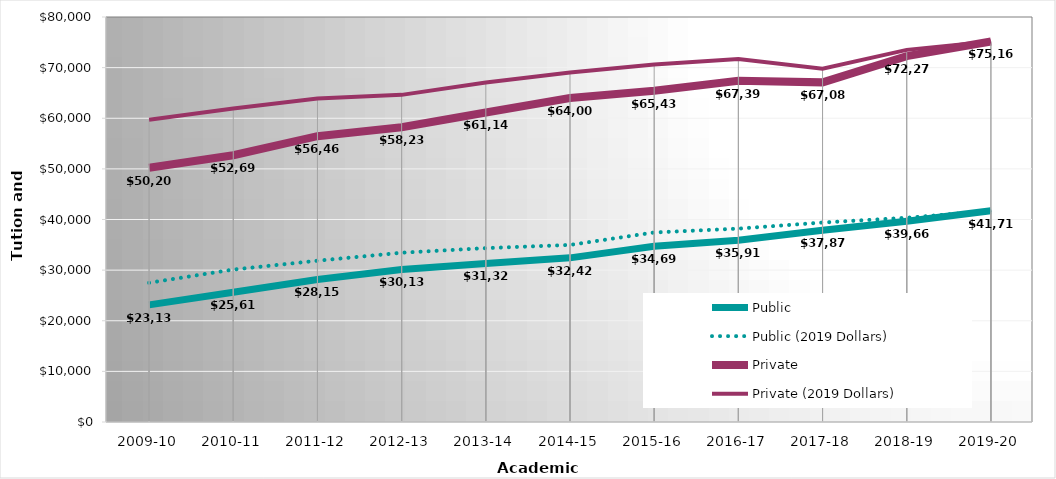
| Category | Public | Public (2019 Dollars) | Private | Private (2019 Dollars) |
|---|---|---|---|---|
| 2009-10 | 23130 | 27498.56 | 50209 | 59691.96 |
| 2010-11 | 25618 | 30112.08 | 52697 | 61941.45 |
| 2011-12 | 28151 | 31857.09 | 56463 | 63896.37 |
| 2012-13 | 30137 | 33438.69 | 58238 | 64618.32 |
| 2013-14 | 31322 | 34346.53 | 61143 | 67047.12 |
| 2014-15 | 32426 | 34977.24 | 64004 | 69039.76 |
| 2015-16 | 34695.56 | 37438.89 | 65437.27 | 70611.02 |
| 2016-17 | 35916.95 | 38197.72 | 67398.89 | 71678.93 |
| 2017-18 | 37877.21 | 39402.62 | 67086.74 | 69788.49 |
| 2018-19 | 39661.92 | 40340.66 | 72270.85 | 73507.62 |
| 2019-20 | 41711.28 | 41711.28 | 75160.74 | 75160.74 |